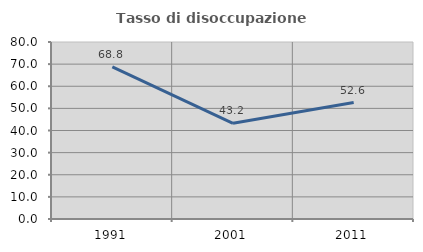
| Category | Tasso di disoccupazione giovanile  |
|---|---|
| 1991.0 | 68.786 |
| 2001.0 | 43.243 |
| 2011.0 | 52.632 |